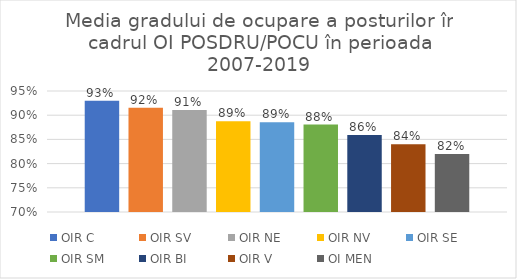
| Category | OIR C | OIR SV | OIR NE | OIR NV | OIR SE | OIR SM | OIR BI | OIR V | OI MEN |
|---|---|---|---|---|---|---|---|---|---|
| 0 | 0.93 | 0.915 | 0.911 | 0.888 | 0.886 | 0.881 | 0.859 | 0.84 | 0.82 |